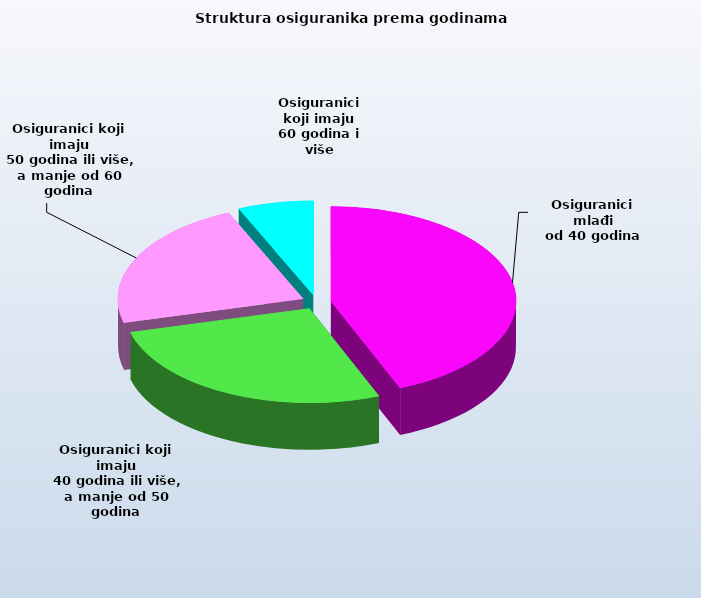
| Category | Series 0 |
|---|---|
| Osiguranici mlađi
od 40 godina | 676665 |
| Osiguranici koji imaju
 40 godina ili više, a manje od 50 godina | 416560 |
| Osiguranici koji imaju
 50 godina ili više, a manje od 60 godina | 346744 |
| Osiguranici koji imaju
60 godina i više | 101644 |